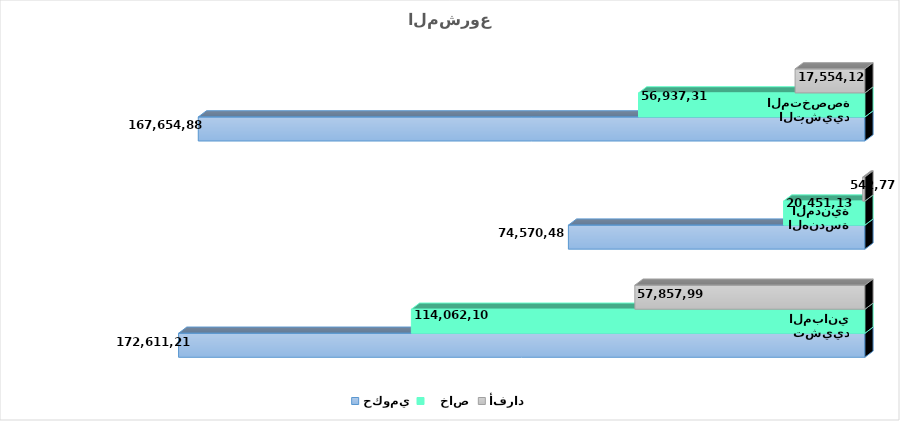
| Category | حكومي  |    خاص  | أفراد       |
|---|---|---|---|
| تشييد المباني | 172611215.7 | 114062101.65 | 57857995.65 |
| الهندسة المدنية | 74570486.55 | 20451130.35 | 542772.615 |
| أنشطة التشييد المتخصصة | 167654881.8 | 56937311.55 | 17554125.75 |